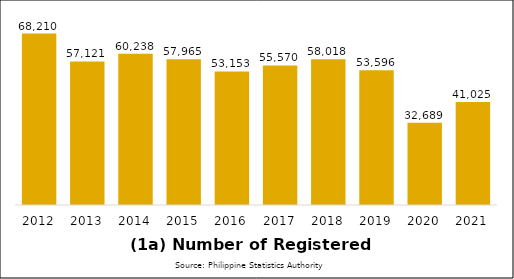
| Category | Series 1 |
|---|---|
| 2012.0 | 68210 |
| 2013.0 | 57121 |
| 2014.0 | 60238 |
| 2015.0 | 57965 |
| 2016.0 | 53153 |
| 2017.0 | 55570 |
| 2018.0 | 58018 |
| 2019.0 | 53596 |
| 2020.0 | 32689 |
| 2021.0 | 41025 |